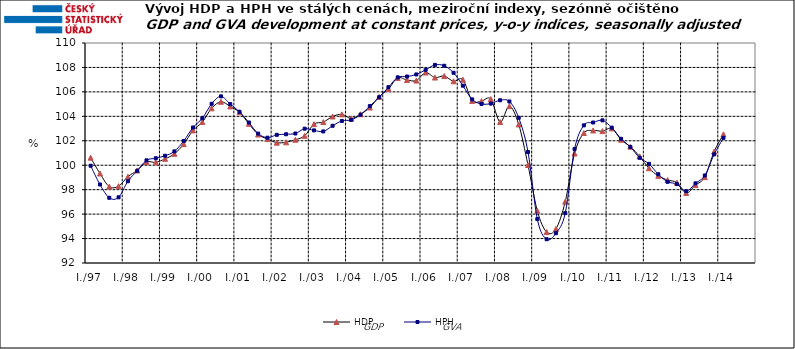
| Category | HDP

 | HPH

 |
|---|---|---|
| I./97 | 100.616 | 99.955 |
|  | 99.326 | 98.423 |
|  | 98.252 | 97.336 |
|  | 98.285 | 97.375 |
| I./98 | 99.06 | 98.689 |
|  | 99.571 | 99.544 |
|  | 100.264 | 100.399 |
|  | 100.237 | 100.572 |
| I./99 | 100.523 | 100.774 |
|  | 100.935 | 101.133 |
|  | 101.726 | 101.985 |
|  | 102.85 | 103.087 |
| I./00 | 103.534 | 103.84 |
|  | 104.655 | 105.026 |
|  | 105.193 | 105.636 |
|  | 104.809 | 105 |
| I./01 | 104.333 | 104.368 |
|  | 103.393 | 103.498 |
|  | 102.512 | 102.587 |
|  | 102.145 | 102.253 |
| I./02 | 101.846 | 102.488 |
|  | 101.874 | 102.535 |
|  | 102.085 | 102.597 |
|  | 102.408 | 102.989 |
| I./03 | 103.362 | 102.85 |
|  | 103.531 | 102.765 |
|  | 103.987 | 103.228 |
|  | 104.162 | 103.624 |
| I./04 | 103.819 | 103.711 |
|  | 104.172 | 104.134 |
|  | 104.72 | 104.837 |
|  | 105.592 | 105.566 |
| I./05 | 106.247 | 106.384 |
|  | 107.143 | 107.186 |
|  | 106.975 | 107.258 |
|  | 106.928 | 107.427 |
| I./06 | 107.58 | 107.805 |
|  | 107.174 | 108.207 |
|  | 107.295 | 108.137 |
|  | 106.866 | 107.563 |
| I./07 | 107.001 | 106.508 |
|  | 105.264 | 105.385 |
|  | 105.246 | 105.012 |
|  | 105.413 | 105.044 |
| I./08 | 103.537 | 105.315 |
|  | 104.833 | 105.214 |
|  | 103.338 | 103.881 |
|  | 100.015 | 101.081 |
| I./09 | 96.269 | 95.595 |
|  | 94.531 | 93.944 |
|  | 94.786 | 94.441 |
|  | 97.02 | 96.083 |
| I./10 | 100.959 | 101.321 |
|  | 102.638 | 103.262 |
|  | 102.845 | 103.495 |
|  | 102.79 | 103.672 |
| I./11 | 103.012 | 103.074 |
|  | 102.088 | 102.16 |
|  | 101.516 | 101.488 |
|  | 100.719 | 100.608 |
| I./12 | 99.751 | 100.113 |
|  | 99.129 | 99.262 |
|  | 98.786 | 98.643 |
|  | 98.578 | 98.458 |
| I./13 | 97.722 | 97.875 |
|  | 98.379 | 98.517 |
|  | 99.027 | 99.163 |
|  | 101.115 | 100.888 |
| I./14 | 102.528 | 102.236 |